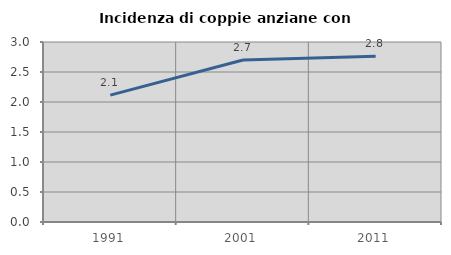
| Category | Incidenza di coppie anziane con figli |
|---|---|
| 1991.0 | 2.114 |
| 2001.0 | 2.699 |
| 2011.0 | 2.764 |